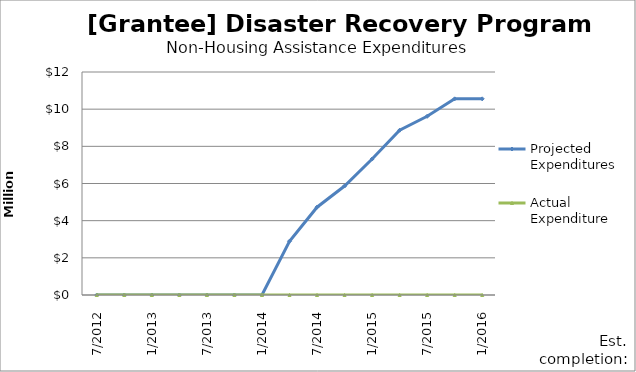
| Category | Projected Expenditures | Actual Expenditure |
|---|---|---|
| 7/2012 | 0 | 0 |
| 10/2012 | 0 | 0 |
| 1/2013 | 0 | 0 |
| 4/2013 | 0 | 0 |
| 7/2013 | 0 | 0 |
| 10/2013 | 0 | 0 |
| 1/2014 | 0 | 0 |
| 4/2014 | 2895000 | 0 |
| 7/2014 | 4724600 | 0 |
| 10/2014 | 5865000 | 0 |
| 1/2015 | 7316000 | 0 |
| 4/2015 | 8866000 | 0 |
| 7/2015 | 9616000 | 0 |
| 10/2015 | 10556000 | 0 |
| 1/2016 | 10556000 | 0 |